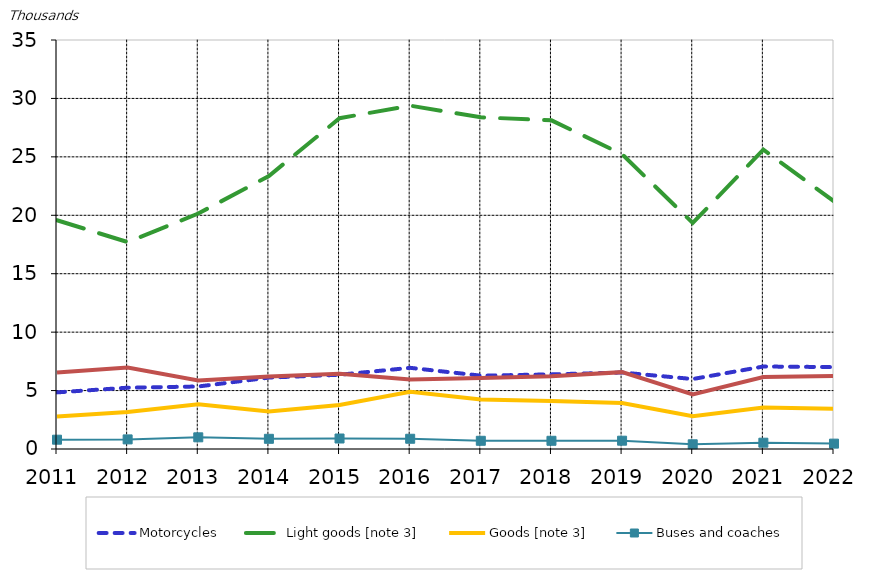
| Category | Motorcycles | Light goods [note 3] | Goods [note 3] | Buses and coaches | Other vehicles |
|---|---|---|---|---|---|
| 2011 | 4.845 | 19.577 | 2.774 | 0.796 | 6.549 |
| 2012 | 5.246 | 17.707 | 3.168 | 0.822 | 6.975 |
| 2013 | 5.349 | 20.151 | 3.821 | 0.999 | 5.859 |
| 2014 | 6.11 | 23.363 | 3.209 | 0.872 | 6.196 |
| 2015 | 6.355 | 28.307 | 3.767 | 0.898 | 6.444 |
| 2016 | 6.946 | 29.382 | 4.894 | 0.877 | 5.957 |
| 2017 | 6.277 | 28.385 | 4.24 | 0.703 | 6.084 |
| 2018 | 6.386 | 28.126 | 4.098 | 0.702 | 6.236 |
| 2019 | 6.546 | 25.225 | 3.94 | 0.711 | 6.578 |
| 2020 | 5.988 | 19.339 | 2.804 | 0.403 | 4.674 |
| 2021 | 7.059 | 25.613 | 3.542 | 0.539 | 6.161 |
| 2022 | 7.01 | 21.199 | 3.445 | 0.459 | 6.259 |